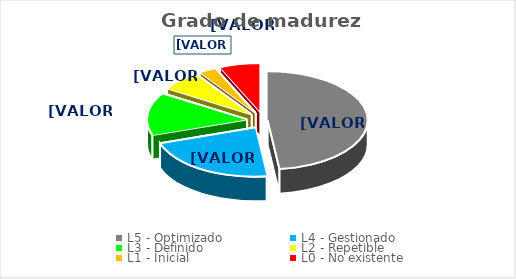
| Category | Series 0 |
|---|---|
| L5 - Optimizado | 0.481 |
| L4 - Gestionado | 0.217 |
| L3 - Definido | 0.142 |
| L2 - Repetible | 0.066 |
| L1 - Inicial | 0.028 |
| L0 - No existente | 0.066 |